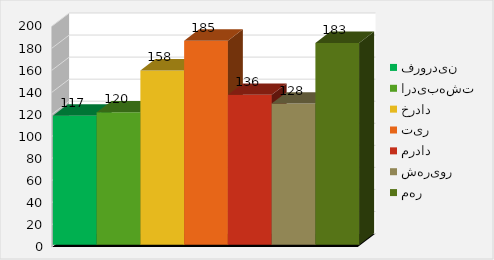
| Category | فروردین | اردیبهشت | خرداد | تیر | مرداد | شهریور | مهر |
|---|---|---|---|---|---|---|---|
| درآمد | 117 | 120 | 158 | 185 | 136 | 128 | 183 |